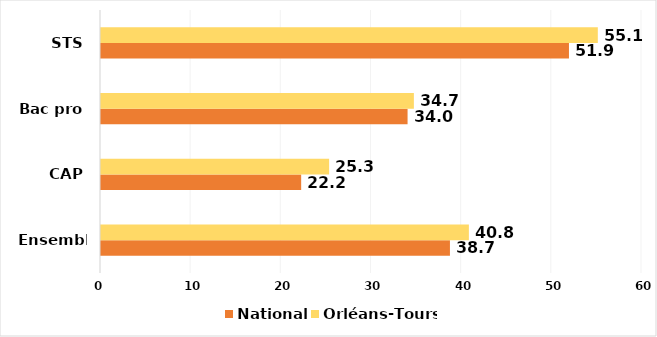
| Category | National | Orléans-Tours |
|---|---|---|
| Ensemble | 38.7 | 40.8 |
| CAP | 22.2 | 25.3 |
| Bac pro | 34 | 34.7 |
| STS | 51.9 | 55.1 |